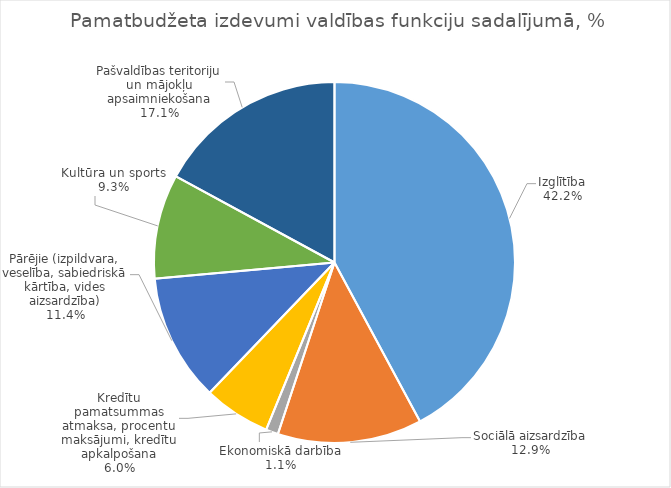
| Category | Series 0 |
|---|---|
| Izglītība | 11480580 |
| Sociālā aizsardzība | 3522202 |
| Ekonomiskā darbība | 301130 |
| Kredītu pamatsummas atmaksa, procentu maksājumi, kredītu apkalpošana | 1630553 |
| Pārējie (izpildvara, veselība, sabiedriskā kārtība, vides aizsardzība) | 3109295 |
| Kultūra un sports | 2544947 |
| Pašvaldības teritoriju un mājokļu apsaimniekošana | 4653692 |